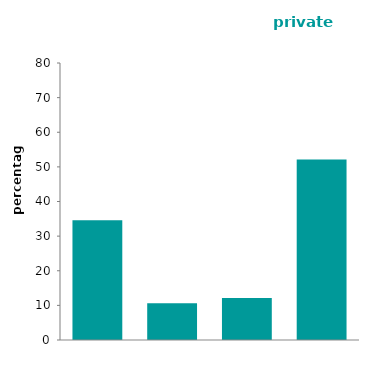
| Category | Series 0 |
|---|---|
| accepted as homeless | 34.59 |
| in priority need | 10.637 |
| offered accommodation | 12.118 |
| none | 52.116 |